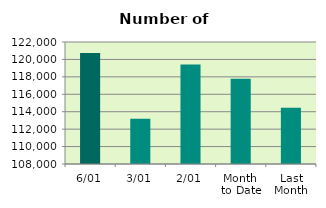
| Category | Series 0 |
|---|---|
| 6/01 | 120738 |
| 3/01 | 113206 |
| 2/01 | 119416 |
| Month 
to Date | 117786.667 |
| Last
Month | 114459.3 |